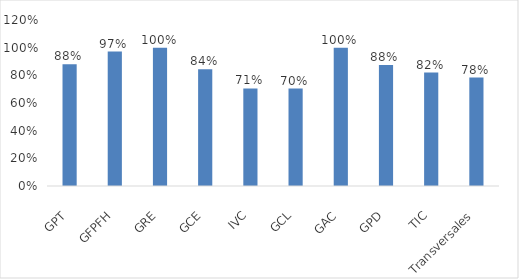
| Category | Series 0 |
|---|---|
| GPT | 0.88 |
| GFPFH | 0.971 |
| GRE | 1 |
| GCE | 0.844 |
| IVC | 0.706 |
| GCL | 0.704 |
| GAC | 1 |
| GPD | 0.875 |
| TIC | 0.82 |
| Transversales | 0.784 |